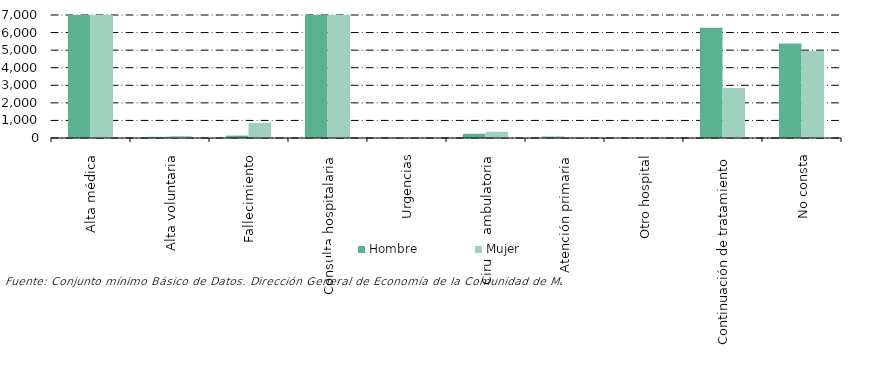
| Category | Hombre | Mujer |
|---|---|---|
| Alta médica | 83454 | 117669 |
| Alta voluntaria | 66 | 114 |
| Fallecimiento | 137 | 866 |
| Consulta hospitalaria | 35446 | 41362 |
| Urgencias | 20 | 19 |
| Cirugía ambulatoria | 241 | 353 |
| Atención primaria | 81 | 36 |
| Otro hospital | 21 | 15 |
| Continuación de tratamiento | 6270 | 2850 |
| No consta | 5383 | 4953 |